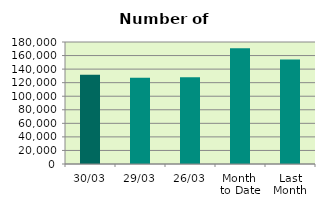
| Category | Series 0 |
|---|---|
| 30/03 | 131836 |
| 29/03 | 127174 |
| 26/03 | 127856 |
| Month 
to Date | 170773.091 |
| Last
Month | 154356.5 |